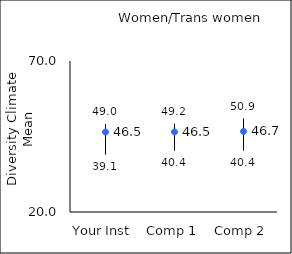
| Category | 25th percentile | 75th percentile | Mean |
|---|---|---|---|
| Your Inst | 39.1 | 49 | 46.48 |
| Comp 1 | 40.4 | 49.2 | 46.52 |
| Comp 2 | 40.4 | 50.9 | 46.68 |